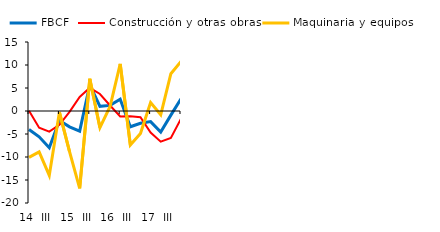
| Category | FBCF | Construcción y otras obras | Maquinaria y equipos |
|---|---|---|---|
| 14 | -4.008 | 0.049 | -10.09 |
| II | -5.616 | -3.638 | -8.904 |
| III | -8 | -4.482 | -13.993 |
| IV | -2.047 | -2.993 | -0.248 |
| 15 | -3.445 | -0.185 | -8.825 |
| II | -4.369 | 3.044 | -16.825 |
| III | 5.673 | 5.033 | 7.009 |
| IV | 1.01 | 3.701 | -3.622 |
| 16 | 1.219 | 1.2 | 0.982 |
| II | 2.546 | -1.173 | 10.243 |
| III | -3.431 | -1.165 | -7.389 |
| IV | -2.665 | -1.371 | -4.907 |
| 17 | -2.307 | -4.7 | 1.817 |
| II | -4.583 | -6.675 | -0.83 |
| III | -0.894 | -5.856 | 8.106 |
| IV | 2.654 | -1.695 | 10.792 |